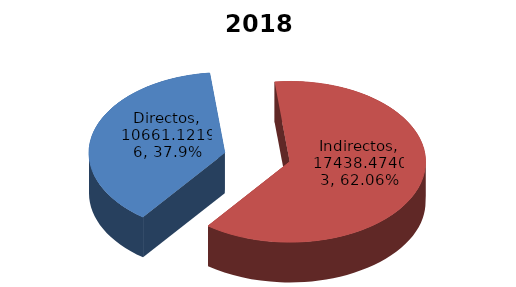
| Category | Series 0 |
|---|---|
| Directos | 10661.122 |
| Indirectos | 17438.474 |